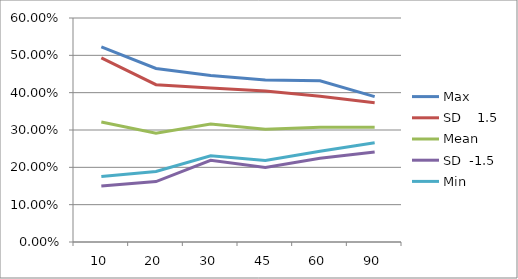
| Category | Max | SD    1.5 | Mean | SD  -1.5 | Min |
|---|---|---|---|---|---|
| 10.0 | 0.523 | 0.493 | 0.321 | 0.15 | 0.175 |
| 20.0 | 0.465 | 0.421 | 0.292 | 0.162 | 0.189 |
| 30.0 | 0.446 | 0.413 | 0.316 | 0.219 | 0.231 |
| 45.0 | 0.434 | 0.404 | 0.302 | 0.2 | 0.218 |
| 60.0 | 0.432 | 0.39 | 0.307 | 0.224 | 0.243 |
| 90.0 | 0.389 | 0.373 | 0.307 | 0.241 | 0.266 |